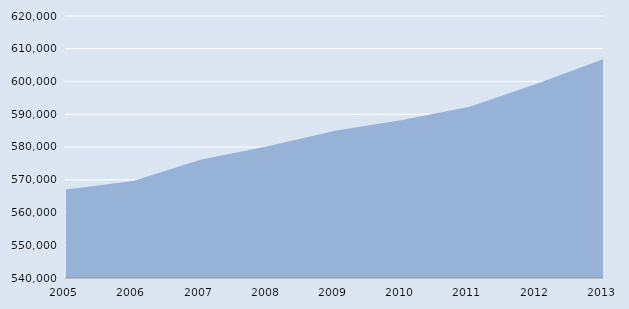
| Category | Series 0 |
|---|---|
| 2005.0 | 567000 |
| 2006.0 | 569600 |
| 2007.0 | 576084 |
| 2008.0 | 580240 |
| 2009.0 | 585000 |
| 2010.0 | 588276 |
| 2011.0 | 592281 |
| 2012.0 | 599333 |
| 2013.0 | 606897 |